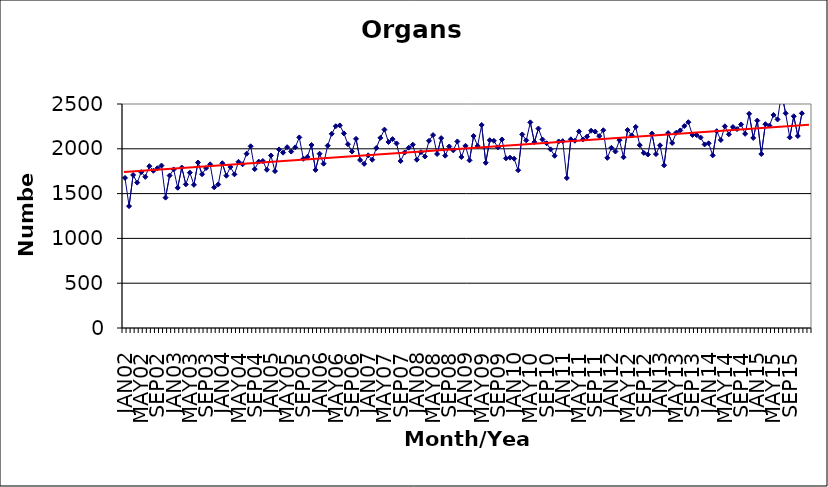
| Category | Series 0 |
|---|---|
| JAN02 | 1675 |
| FEB02 | 1360 |
| MAR02 | 1708 |
| APR02 | 1623 |
| MAY02 | 1740 |
| JUN02 | 1687 |
| JUL02 | 1806 |
| AUG02 | 1755 |
| SEP02 | 1783 |
| OCT02 | 1813 |
| NOV02 | 1455 |
| DEC02 | 1701 |
| JAN03 | 1770 |
| FEB03 | 1565 |
| MAR03 | 1791 |
| APR03 | 1603 |
| MAY03 | 1734 |
| JUN03 | 1598 |
| JUL03 | 1847 |
| AUG03 | 1716 |
| SEP03 | 1785 |
| OCT03 | 1827 |
| NOV03 | 1570 |
| DEC03 | 1602 |
| JAN04 | 1839 |
| FEB04 | 1700 |
| MAR04 | 1797 |
| APR04 | 1715 |
| MAY04 | 1855 |
| JUN04 | 1827 |
| JUL04 | 1945 |
| AUG04 | 2028 |
| SEP04 | 1773 |
| OCT04 | 1857 |
| NOV04 | 1864 |
| DEC04 | 1766 |
| JAN05 | 1925 |
| FEB05 | 1750 |
| MAR05 | 1993 |
| APR05 | 1957 |
| MAY05 | 2018 |
| JUN05 | 1969 |
| JUL05 | 2016 |
| AUG05 | 2127 |
| SEP05 | 1888 |
| OCT05 | 1910 |
| NOV05 | 2042 |
| DEC05 | 1764 |
| JAN06 | 1945 |
| FEB06 | 1834 |
| MAR06 | 2035 |
| APR06 | 2167 |
| MAY06 | 2252 |
| JUN06 | 2261 |
| JUL06 | 2172 |
| AUG06 | 2051 |
| SEP06 | 1969 |
| OCT06 | 2111 |
| NOV06 | 1875 |
| DEC06 | 1832 |
| JAN07 | 1927 |
| FEB07 | 1878 |
| MAR07 | 2009 |
| APR07 | 2122 |
| MAY07 | 2214 |
| JUN07 | 2076 |
| JUL07 | 2108 |
| AUG07 | 2060 |
| SEP07 | 1863 |
| OCT07 | 1959 |
| NOV07 | 2012 |
| DEC07 | 2046 |
| JAN08 | 1878 |
| FEB08 | 1962 |
| MAR08 | 1914 |
| APR08 | 2089 |
| MAY08 | 2153 |
| JUN08 | 1942 |
| JUL08 | 2119 |
| AUG08 | 1923 |
| SEP08 | 2026 |
| OCT08 | 1983 |
| NOV08 | 2082 |
| DEC08 | 1908 |
| JAN09 | 2033 |
| FEB09 | 1871 |
| MAR09 | 2143 |
| APR09 | 2032 |
| MAY09 | 2266 |
| JUN09 | 1844 |
| JUL09 | 2096 |
| AUG09 | 2089 |
| SEP09 | 2016 |
| OCT09 | 2104 |
| NOV09 | 1894 |
| DEC09 | 1901 |
| JAN10 | 1890 |
| FEB10 | 1761 |
| MAR10 | 2160 |
| APR10 | 2094 |
| MAY10 | 2295 |
| JUN10 | 2075 |
| JUL10 | 2226 |
| AUG10 | 2104 |
| SEP10 | 2062 |
| OCT10 | 1994 |
| NOV10 | 1922 |
| DEC10 | 2082 |
| JAN11 | 2085 |
| FEB11 | 1674 |
| MAR11 | 2106 |
| APR11 | 2090 |
| MAY11 | 2194 |
| JUN11 | 2105 |
| JUL11 | 2136 |
| AUG11 | 2202 |
| SEP11 | 2192 |
| OCT11 | 2142 |
| NOV11 | 2207 |
| DEC11 | 1899 |
| JAN12 | 2011 |
| FEB12 | 1970 |
| MAR12 | 2096 |
| APR12 | 1906 |
| MAY12 | 2210 |
| JUN12 | 2150 |
| JUL12 | 2244 |
| AUG12 | 2041 |
| SEP12 | 1954 |
| OCT12 | 1936 |
| NOV12 | 2170 |
| DEC12 | 1941 |
| JAN13 | 2039 |
| FEB13 | 1816 |
| MAR13 | 2175 |
| APR13 | 2065 |
| MAY13 | 2179 |
| JUN13 | 2205 |
| JUL13 | 2254 |
| AUG13 | 2297 |
| SEP13 | 2154 |
| OCT13 | 2154 |
| NOV13 | 2126 |
| DEC13 | 2049 |
| JAN14 | 2061 |
| FEB14 | 1927 |
| MAR14 | 2197 |
| APR14 | 2098 |
| MAY14 | 2251 |
| JUN14 | 2162 |
| JUL14 | 2243 |
| AUG14 | 2220 |
| SEP14 | 2272 |
| OCT14 | 2167 |
| NOV14 | 2391 |
| DEC14 | 2121 |
| JAN15 | 2315 |
| FEB15 | 1942 |
| MAR15 | 2275 |
| APR15 | 2259 |
| MAY15 | 2378 |
| JUN15 | 2328 |
| JUL15 | 2618 |
| AUG15 | 2396 |
| SEP15 | 2127 |
| OCT15 | 2363 |
| NOV15 | 2143 |
| DEC15 | 2396 |